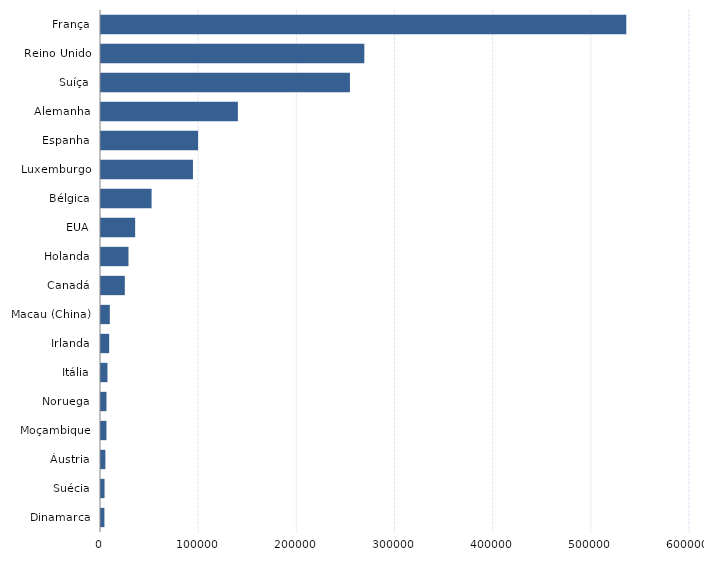
| Category | Series 0 |
|---|---|
| Dinamarca | 3486 |
| Suécia | 3616 |
| Áustria | 4454 |
| Moçambique | 5560 |
| Noruega | 5565 |
| Itália | 6583 |
| Irlanda | 8310 |
| Macau (China) | 8991 |
| Canadá | 24270 |
| Holanda | 28002 |
| EUA | 34793 |
| Bélgica | 51519 |
| Luxemburgo | 93678 |
| Espanha | 98874 |
| Alemanha | 139435 |
| Suíça | 253589 |
| Reino Unido | 268245 |
| França | 535100 |